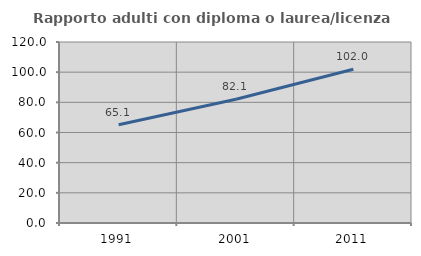
| Category | Rapporto adulti con diploma o laurea/licenza media  |
|---|---|
| 1991.0 | 65.116 |
| 2001.0 | 82.051 |
| 2011.0 | 101.961 |